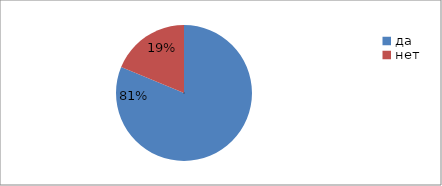
| Category | Series 0 | Series 1 |
|---|---|---|
| да | 81.3 | 81.3 |
| нет | 18.8 | 18.8 |